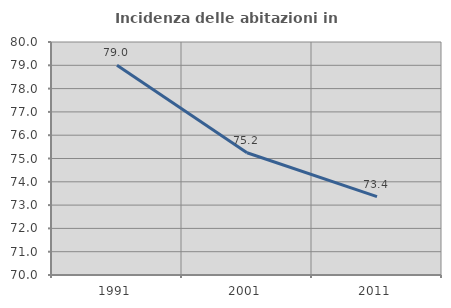
| Category | Incidenza delle abitazioni in proprietà  |
|---|---|
| 1991.0 | 79.006 |
| 2001.0 | 75.248 |
| 2011.0 | 73.363 |